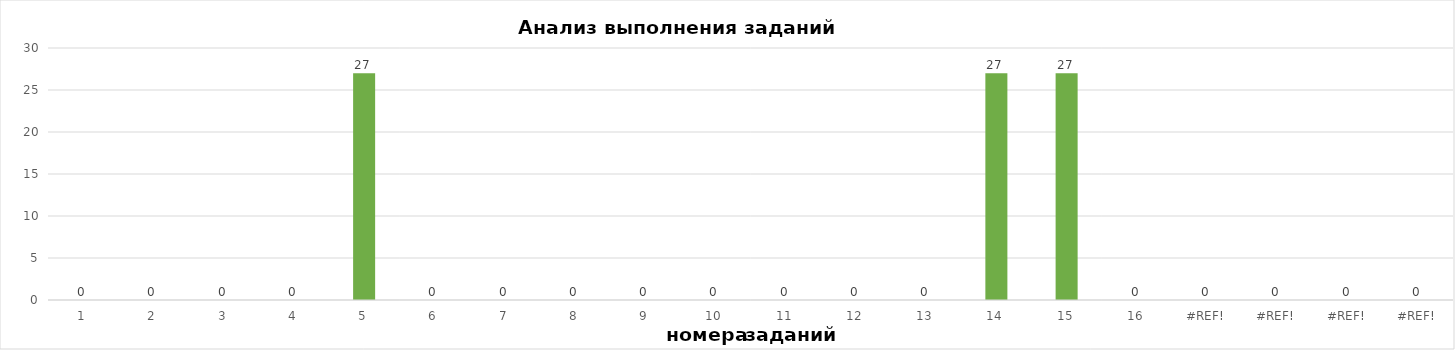
| Category | задания |
|---|---|
| 1.0 | 0 |
| 2.0 | 0 |
| 3.0 | 0 |
| 4.0 | 0 |
| 5.0 | 27 |
| 6.0 | 0 |
| 7.0 | 0 |
| 8.0 | 0 |
| 9.0 | 0 |
| 10.0 | 0 |
| 11.0 | 0 |
| 12.0 | 0 |
| 13.0 | 0 |
| 14.0 | 27 |
| 15.0 | 27 |
| 16.0 | 0 |
| 0.0 | 0 |
| 0.0 | 0 |
| 0.0 | 0 |
| 0.0 | 0 |